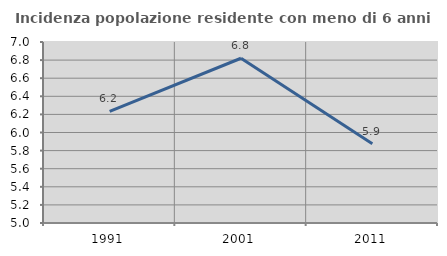
| Category | Incidenza popolazione residente con meno di 6 anni |
|---|---|
| 1991.0 | 6.233 |
| 2001.0 | 6.821 |
| 2011.0 | 5.876 |